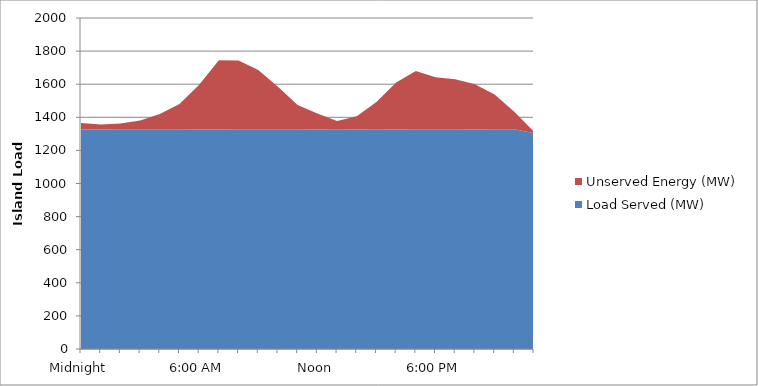
| Category | Load Served (MW) | Unserved Energy (MW) |
|---|---|---|
| Midnight | 1326.621 | 39.125 |
|  | 1325.982 | 30.333 |
|  | 1327.44 | 34.935 |
|  | 1327.811 | 53.258 |
|  | 1327.144 | 92.901 |
|  | 1327.395 | 152.693 |
| 6:00 AM | 1326.349 | 270.688 |
|  | 1326.411 | 418.492 |
|  | 1327.784 | 415.634 |
|  | 1327.058 | 358.891 |
|  | 1327.136 | 257.86 |
|  | 1327.827 | 146.375 |
| Noon | 1326.958 | 96.258 |
|  | 1327.735 | 49.924 |
|  | 1326.917 | 79.37 |
|  | 1327.798 | 165.135 |
|  | 1326.611 | 284.196 |
|  | 1327.554 | 351.721 |
| 6:00 PM | 1327.557 | 314.871 |